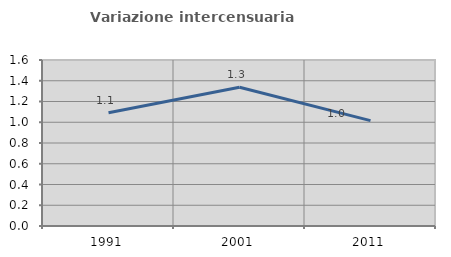
| Category | Variazione intercensuaria annua |
|---|---|
| 1991.0 | 1.091 |
| 2001.0 | 1.338 |
| 2011.0 | 1.016 |